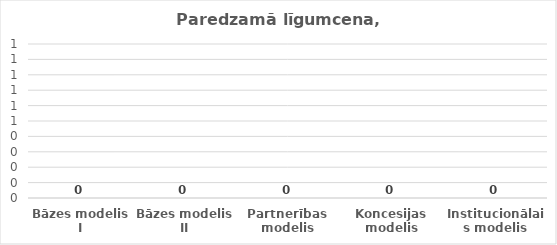
| Category | Series 0 |
|---|---|
| Bāzes modelis I | 0 |
| Bāzes modelis II | 0 |
| Partnerības modelis | 0 |
| Koncesijas modelis | 0 |
| Institucionālais modelis | 0 |